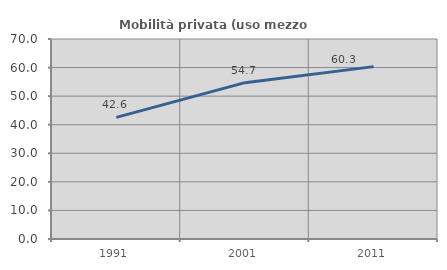
| Category | Mobilità privata (uso mezzo privato) |
|---|---|
| 1991.0 | 42.555 |
| 2001.0 | 54.719 |
| 2011.0 | 60.331 |